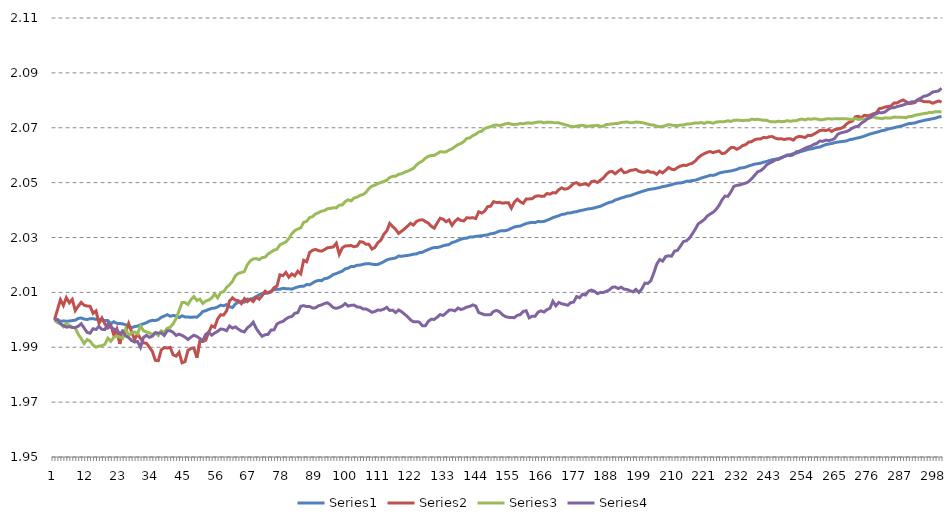
| Category | Series 0 | Series 1 | Series 2 | Series 3 |
|---|---|---|---|---|
| 0 | 2 | 2 | 2 | 2 |
| 1 | 2 | 2.004 | 1.999 | 2 |
| 2 | 1.999 | 2.007 | 1.999 | 1.999 |
| 3 | 2 | 2.005 | 1.997 | 1.998 |
| 4 | 1.999 | 2.008 | 1.999 | 1.997 |
| 5 | 2 | 2.006 | 1.998 | 1.997 |
| 6 | 2 | 2.007 | 1.997 | 1.997 |
| 7 | 2 | 2.003 | 1.997 | 1.997 |
| 8 | 2 | 2.005 | 1.995 | 1.998 |
| 9 | 2.001 | 2.006 | 1.993 | 1.999 |
| 10 | 2 | 2.005 | 1.991 | 1.997 |
| 11 | 2 | 2.005 | 1.993 | 1.995 |
| 12 | 2 | 2.005 | 1.992 | 1.995 |
| 13 | 2 | 2.002 | 1.991 | 1.997 |
| 14 | 2 | 2.003 | 1.99 | 1.997 |
| 15 | 2 | 1.999 | 1.99 | 1.998 |
| 16 | 2 | 2.001 | 1.991 | 1.997 |
| 17 | 2 | 1.998 | 1.991 | 1.996 |
| 18 | 2 | 1.997 | 1.993 | 1.999 |
| 19 | 1.999 | 1.998 | 1.992 | 1.997 |
| 20 | 1.999 | 1.994 | 1.994 | 1.997 |
| 21 | 1.999 | 1.997 | 1.994 | 1.996 |
| 22 | 1.999 | 1.991 | 1.994 | 1.995 |
| 23 | 1.999 | 1.996 | 1.993 | 1.996 |
| 24 | 1.998 | 1.996 | 1.997 | 1.994 |
| 25 | 1.998 | 1.999 | 1.994 | 1.994 |
| 26 | 1.997 | 1.996 | 1.995 | 1.992 |
| 27 | 1.998 | 1.993 | 1.996 | 1.992 |
| 28 | 1.998 | 1.995 | 1.995 | 1.992 |
| 29 | 1.998 | 1.993 | 1.998 | 1.99 |
| 30 | 1.999 | 1.992 | 1.996 | 1.994 |
| 31 | 1.999 | 1.991 | 1.996 | 1.994 |
| 32 | 2 | 1.99 | 1.995 | 1.994 |
| 33 | 2 | 1.988 | 1.995 | 1.994 |
| 34 | 2 | 1.985 | 1.995 | 1.995 |
| 35 | 2 | 1.985 | 1.994 | 1.995 |
| 36 | 2.001 | 1.989 | 1.996 | 1.995 |
| 37 | 2.001 | 1.99 | 1.995 | 1.994 |
| 38 | 2.002 | 1.99 | 1.997 | 1.996 |
| 39 | 2.001 | 1.99 | 1.997 | 1.996 |
| 40 | 2.002 | 1.987 | 1.999 | 1.995 |
| 41 | 2.001 | 1.987 | 2 | 1.994 |
| 42 | 2.001 | 1.988 | 2.003 | 1.995 |
| 43 | 2.001 | 1.984 | 2.006 | 1.994 |
| 44 | 2.001 | 1.985 | 2.006 | 1.994 |
| 45 | 2.001 | 1.989 | 2.006 | 1.993 |
| 46 | 2.001 | 1.99 | 2.007 | 1.994 |
| 47 | 2.001 | 1.99 | 2.008 | 1.994 |
| 48 | 2.001 | 1.986 | 2.007 | 1.994 |
| 49 | 2.002 | 1.992 | 2.008 | 1.993 |
| 50 | 2.003 | 1.992 | 2.006 | 1.992 |
| 51 | 2.003 | 1.993 | 2.007 | 1.995 |
| 52 | 2.004 | 1.995 | 2.007 | 1.996 |
| 53 | 2.004 | 1.998 | 2.008 | 1.994 |
| 54 | 2.004 | 1.997 | 2.009 | 1.995 |
| 55 | 2.005 | 2 | 2.008 | 1.996 |
| 56 | 2.005 | 2.002 | 2.01 | 1.997 |
| 57 | 2.005 | 2.002 | 2.01 | 1.997 |
| 58 | 2.006 | 2.003 | 2.012 | 1.996 |
| 59 | 2.005 | 2.007 | 2.013 | 1.998 |
| 60 | 2.004 | 2.008 | 2.014 | 1.997 |
| 61 | 2.006 | 2.007 | 2.016 | 1.997 |
| 62 | 2.006 | 2.007 | 2.017 | 1.997 |
| 63 | 2.007 | 2.006 | 2.017 | 1.996 |
| 64 | 2.006 | 2.008 | 2.018 | 1.996 |
| 65 | 2.008 | 2.007 | 2.02 | 1.997 |
| 66 | 2.007 | 2.007 | 2.021 | 1.998 |
| 67 | 2.008 | 2.007 | 2.022 | 1.999 |
| 68 | 2.008 | 2.008 | 2.022 | 1.997 |
| 69 | 2.009 | 2.008 | 2.022 | 1.995 |
| 70 | 2.01 | 2.009 | 2.023 | 1.994 |
| 71 | 2.01 | 2.01 | 2.023 | 1.995 |
| 72 | 2.01 | 2.01 | 2.024 | 1.995 |
| 73 | 2.01 | 2.01 | 2.025 | 1.996 |
| 74 | 2.011 | 2.012 | 2.025 | 1.996 |
| 75 | 2.011 | 2.012 | 2.026 | 1.998 |
| 76 | 2.011 | 2.016 | 2.027 | 1.999 |
| 77 | 2.011 | 2.016 | 2.028 | 1.999 |
| 78 | 2.011 | 2.017 | 2.028 | 2 |
| 79 | 2.011 | 2.016 | 2.03 | 2.001 |
| 80 | 2.011 | 2.017 | 2.031 | 2.001 |
| 81 | 2.012 | 2.016 | 2.033 | 2.002 |
| 82 | 2.012 | 2.018 | 2.033 | 2.003 |
| 83 | 2.012 | 2.017 | 2.033 | 2.005 |
| 84 | 2.012 | 2.022 | 2.036 | 2.005 |
| 85 | 2.013 | 2.021 | 2.036 | 2.005 |
| 86 | 2.013 | 2.025 | 2.037 | 2.005 |
| 87 | 2.013 | 2.025 | 2.038 | 2.004 |
| 88 | 2.014 | 2.026 | 2.039 | 2.004 |
| 89 | 2.014 | 2.025 | 2.039 | 2.005 |
| 90 | 2.014 | 2.025 | 2.04 | 2.005 |
| 91 | 2.015 | 2.026 | 2.04 | 2.006 |
| 92 | 2.015 | 2.026 | 2.041 | 2.006 |
| 93 | 2.016 | 2.026 | 2.041 | 2.005 |
| 94 | 2.017 | 2.027 | 2.041 | 2.004 |
| 95 | 2.017 | 2.028 | 2.041 | 2.004 |
| 96 | 2.017 | 2.024 | 2.042 | 2.005 |
| 97 | 2.018 | 2.026 | 2.042 | 2.005 |
| 98 | 2.019 | 2.027 | 2.043 | 2.006 |
| 99 | 2.019 | 2.027 | 2.044 | 2.005 |
| 100 | 2.019 | 2.027 | 2.043 | 2.005 |
| 101 | 2.019 | 2.027 | 2.044 | 2.005 |
| 102 | 2.02 | 2.027 | 2.045 | 2.005 |
| 103 | 2.02 | 2.028 | 2.045 | 2.005 |
| 104 | 2.02 | 2.028 | 2.046 | 2.004 |
| 105 | 2.02 | 2.028 | 2.046 | 2.004 |
| 106 | 2.02 | 2.028 | 2.048 | 2.003 |
| 107 | 2.02 | 2.026 | 2.049 | 2.003 |
| 108 | 2.02 | 2.026 | 2.049 | 2.003 |
| 109 | 2.02 | 2.028 | 2.05 | 2.004 |
| 110 | 2.021 | 2.029 | 2.05 | 2.003 |
| 111 | 2.021 | 2.031 | 2.05 | 2.004 |
| 112 | 2.022 | 2.032 | 2.051 | 2.005 |
| 113 | 2.022 | 2.035 | 2.052 | 2.003 |
| 114 | 2.022 | 2.034 | 2.052 | 2.004 |
| 115 | 2.023 | 2.033 | 2.052 | 2.003 |
| 116 | 2.023 | 2.031 | 2.053 | 2.004 |
| 117 | 2.023 | 2.032 | 2.053 | 2.003 |
| 118 | 2.023 | 2.033 | 2.054 | 2.002 |
| 119 | 2.023 | 2.034 | 2.054 | 2.001 |
| 120 | 2.024 | 2.035 | 2.055 | 2 |
| 121 | 2.024 | 2.035 | 2.055 | 1.999 |
| 122 | 2.024 | 2.036 | 2.056 | 1.999 |
| 123 | 2.024 | 2.036 | 2.057 | 1.999 |
| 124 | 2.025 | 2.036 | 2.058 | 1.998 |
| 125 | 2.025 | 2.036 | 2.059 | 1.998 |
| 126 | 2.026 | 2.035 | 2.06 | 1.999 |
| 127 | 2.026 | 2.034 | 2.06 | 2 |
| 128 | 2.026 | 2.033 | 2.06 | 2 |
| 129 | 2.026 | 2.035 | 2.061 | 2.001 |
| 130 | 2.027 | 2.037 | 2.061 | 2.002 |
| 131 | 2.027 | 2.037 | 2.061 | 2.002 |
| 132 | 2.027 | 2.036 | 2.061 | 2.002 |
| 133 | 2.027 | 2.036 | 2.062 | 2.004 |
| 134 | 2.028 | 2.034 | 2.062 | 2.004 |
| 135 | 2.028 | 2.036 | 2.063 | 2.003 |
| 136 | 2.029 | 2.037 | 2.064 | 2.004 |
| 137 | 2.029 | 2.036 | 2.064 | 2.004 |
| 138 | 2.03 | 2.036 | 2.065 | 2.004 |
| 139 | 2.03 | 2.037 | 2.066 | 2.005 |
| 140 | 2.03 | 2.037 | 2.066 | 2.005 |
| 141 | 2.03 | 2.037 | 2.067 | 2.005 |
| 142 | 2.03 | 2.037 | 2.068 | 2.005 |
| 143 | 2.031 | 2.039 | 2.068 | 2.003 |
| 144 | 2.031 | 2.039 | 2.069 | 2.002 |
| 145 | 2.031 | 2.04 | 2.07 | 2.002 |
| 146 | 2.031 | 2.041 | 2.07 | 2.002 |
| 147 | 2.031 | 2.041 | 2.07 | 2.002 |
| 148 | 2.031 | 2.043 | 2.071 | 2.003 |
| 149 | 2.032 | 2.043 | 2.071 | 2.003 |
| 150 | 2.032 | 2.043 | 2.071 | 2.003 |
| 151 | 2.032 | 2.042 | 2.071 | 2.002 |
| 152 | 2.032 | 2.043 | 2.071 | 2.001 |
| 153 | 2.033 | 2.043 | 2.072 | 2.001 |
| 154 | 2.033 | 2.041 | 2.071 | 2.001 |
| 155 | 2.034 | 2.043 | 2.071 | 2.001 |
| 156 | 2.034 | 2.044 | 2.071 | 2.002 |
| 157 | 2.034 | 2.043 | 2.072 | 2.002 |
| 158 | 2.035 | 2.042 | 2.071 | 2.003 |
| 159 | 2.035 | 2.044 | 2.072 | 2.003 |
| 160 | 2.035 | 2.044 | 2.072 | 2.001 |
| 161 | 2.036 | 2.044 | 2.072 | 2.001 |
| 162 | 2.035 | 2.045 | 2.072 | 2.001 |
| 163 | 2.036 | 2.045 | 2.072 | 2.003 |
| 164 | 2.036 | 2.045 | 2.072 | 2.003 |
| 165 | 2.036 | 2.045 | 2.072 | 2.003 |
| 166 | 2.036 | 2.046 | 2.072 | 2.004 |
| 167 | 2.037 | 2.046 | 2.072 | 2.004 |
| 168 | 2.037 | 2.046 | 2.072 | 2.007 |
| 169 | 2.038 | 2.046 | 2.072 | 2.005 |
| 170 | 2.038 | 2.047 | 2.072 | 2.006 |
| 171 | 2.038 | 2.048 | 2.071 | 2.006 |
| 172 | 2.039 | 2.048 | 2.071 | 2.006 |
| 173 | 2.039 | 2.048 | 2.071 | 2.005 |
| 174 | 2.039 | 2.049 | 2.07 | 2.006 |
| 175 | 2.039 | 2.05 | 2.07 | 2.006 |
| 176 | 2.039 | 2.05 | 2.071 | 2.008 |
| 177 | 2.04 | 2.049 | 2.071 | 2.008 |
| 178 | 2.04 | 2.049 | 2.071 | 2.009 |
| 179 | 2.04 | 2.05 | 2.071 | 2.009 |
| 180 | 2.04 | 2.049 | 2.07 | 2.01 |
| 181 | 2.041 | 2.05 | 2.071 | 2.011 |
| 182 | 2.041 | 2.051 | 2.071 | 2.01 |
| 183 | 2.041 | 2.05 | 2.071 | 2.01 |
| 184 | 2.041 | 2.051 | 2.071 | 2.01 |
| 185 | 2.042 | 2.052 | 2.071 | 2.01 |
| 186 | 2.042 | 2.053 | 2.071 | 2.01 |
| 187 | 2.043 | 2.054 | 2.071 | 2.011 |
| 188 | 2.043 | 2.054 | 2.071 | 2.012 |
| 189 | 2.044 | 2.053 | 2.072 | 2.012 |
| 190 | 2.044 | 2.054 | 2.072 | 2.011 |
| 191 | 2.044 | 2.055 | 2.072 | 2.012 |
| 192 | 2.045 | 2.054 | 2.072 | 2.011 |
| 193 | 2.045 | 2.054 | 2.072 | 2.011 |
| 194 | 2.045 | 2.054 | 2.072 | 2.011 |
| 195 | 2.046 | 2.055 | 2.072 | 2.01 |
| 196 | 2.046 | 2.055 | 2.072 | 2.011 |
| 197 | 2.046 | 2.054 | 2.072 | 2.01 |
| 198 | 2.047 | 2.054 | 2.072 | 2.011 |
| 199 | 2.047 | 2.054 | 2.072 | 2.013 |
| 200 | 2.047 | 2.054 | 2.071 | 2.013 |
| 201 | 2.048 | 2.054 | 2.071 | 2.014 |
| 202 | 2.048 | 2.054 | 2.071 | 2.017 |
| 203 | 2.048 | 2.053 | 2.071 | 2.02 |
| 204 | 2.048 | 2.054 | 2.07 | 2.022 |
| 205 | 2.049 | 2.054 | 2.07 | 2.021 |
| 206 | 2.049 | 2.055 | 2.071 | 2.023 |
| 207 | 2.049 | 2.056 | 2.071 | 2.023 |
| 208 | 2.049 | 2.055 | 2.071 | 2.023 |
| 209 | 2.05 | 2.055 | 2.071 | 2.025 |
| 210 | 2.05 | 2.055 | 2.071 | 2.025 |
| 211 | 2.05 | 2.056 | 2.071 | 2.027 |
| 212 | 2.05 | 2.056 | 2.071 | 2.029 |
| 213 | 2.05 | 2.056 | 2.071 | 2.029 |
| 214 | 2.051 | 2.057 | 2.071 | 2.03 |
| 215 | 2.051 | 2.057 | 2.071 | 2.031 |
| 216 | 2.051 | 2.058 | 2.072 | 2.033 |
| 217 | 2.051 | 2.059 | 2.072 | 2.035 |
| 218 | 2.052 | 2.06 | 2.072 | 2.036 |
| 219 | 2.052 | 2.061 | 2.072 | 2.037 |
| 220 | 2.052 | 2.061 | 2.072 | 2.038 |
| 221 | 2.053 | 2.061 | 2.072 | 2.039 |
| 222 | 2.053 | 2.061 | 2.072 | 2.039 |
| 223 | 2.053 | 2.061 | 2.072 | 2.04 |
| 224 | 2.053 | 2.062 | 2.072 | 2.042 |
| 225 | 2.054 | 2.061 | 2.072 | 2.044 |
| 226 | 2.054 | 2.061 | 2.072 | 2.045 |
| 227 | 2.054 | 2.062 | 2.073 | 2.045 |
| 228 | 2.054 | 2.063 | 2.072 | 2.047 |
| 229 | 2.055 | 2.063 | 2.073 | 2.049 |
| 230 | 2.055 | 2.062 | 2.073 | 2.049 |
| 231 | 2.055 | 2.063 | 2.073 | 2.049 |
| 232 | 2.055 | 2.064 | 2.073 | 2.05 |
| 233 | 2.056 | 2.064 | 2.073 | 2.05 |
| 234 | 2.056 | 2.065 | 2.073 | 2.05 |
| 235 | 2.056 | 2.065 | 2.073 | 2.051 |
| 236 | 2.057 | 2.066 | 2.073 | 2.053 |
| 237 | 2.057 | 2.066 | 2.073 | 2.054 |
| 238 | 2.057 | 2.066 | 2.073 | 2.054 |
| 239 | 2.057 | 2.066 | 2.073 | 2.055 |
| 240 | 2.058 | 2.066 | 2.073 | 2.056 |
| 241 | 2.058 | 2.067 | 2.072 | 2.057 |
| 242 | 2.058 | 2.067 | 2.072 | 2.058 |
| 243 | 2.059 | 2.066 | 2.072 | 2.058 |
| 244 | 2.059 | 2.066 | 2.072 | 2.058 |
| 245 | 2.059 | 2.066 | 2.072 | 2.059 |
| 246 | 2.059 | 2.066 | 2.072 | 2.06 |
| 247 | 2.06 | 2.066 | 2.073 | 2.06 |
| 248 | 2.06 | 2.066 | 2.072 | 2.06 |
| 249 | 2.061 | 2.065 | 2.073 | 2.06 |
| 250 | 2.061 | 2.066 | 2.073 | 2.061 |
| 251 | 2.061 | 2.067 | 2.073 | 2.061 |
| 252 | 2.061 | 2.067 | 2.073 | 2.062 |
| 253 | 2.062 | 2.066 | 2.073 | 2.063 |
| 254 | 2.062 | 2.067 | 2.073 | 2.063 |
| 255 | 2.062 | 2.067 | 2.073 | 2.063 |
| 256 | 2.063 | 2.068 | 2.073 | 2.064 |
| 257 | 2.063 | 2.068 | 2.073 | 2.064 |
| 258 | 2.063 | 2.069 | 2.073 | 2.065 |
| 259 | 2.063 | 2.069 | 2.073 | 2.065 |
| 260 | 2.064 | 2.069 | 2.073 | 2.065 |
| 261 | 2.064 | 2.069 | 2.073 | 2.065 |
| 262 | 2.064 | 2.069 | 2.073 | 2.066 |
| 263 | 2.065 | 2.069 | 2.073 | 2.066 |
| 264 | 2.065 | 2.07 | 2.073 | 2.068 |
| 265 | 2.065 | 2.07 | 2.073 | 2.068 |
| 266 | 2.065 | 2.07 | 2.073 | 2.068 |
| 267 | 2.065 | 2.071 | 2.073 | 2.069 |
| 268 | 2.066 | 2.072 | 2.073 | 2.069 |
| 269 | 2.066 | 2.072 | 2.073 | 2.07 |
| 270 | 2.066 | 2.074 | 2.073 | 2.07 |
| 271 | 2.066 | 2.074 | 2.073 | 2.071 |
| 272 | 2.067 | 2.074 | 2.073 | 2.072 |
| 273 | 2.067 | 2.075 | 2.073 | 2.072 |
| 274 | 2.067 | 2.074 | 2.073 | 2.073 |
| 275 | 2.068 | 2.075 | 2.074 | 2.074 |
| 276 | 2.068 | 2.075 | 2.074 | 2.075 |
| 277 | 2.068 | 2.075 | 2.074 | 2.075 |
| 278 | 2.069 | 2.077 | 2.073 | 2.076 |
| 279 | 2.069 | 2.077 | 2.073 | 2.075 |
| 280 | 2.069 | 2.078 | 2.074 | 2.076 |
| 281 | 2.07 | 2.078 | 2.074 | 2.077 |
| 282 | 2.07 | 2.078 | 2.074 | 2.077 |
| 283 | 2.07 | 2.079 | 2.074 | 2.077 |
| 284 | 2.07 | 2.079 | 2.074 | 2.078 |
| 285 | 2.07 | 2.08 | 2.074 | 2.078 |
| 286 | 2.071 | 2.08 | 2.074 | 2.078 |
| 287 | 2.071 | 2.08 | 2.074 | 2.079 |
| 288 | 2.072 | 2.079 | 2.074 | 2.079 |
| 289 | 2.072 | 2.079 | 2.074 | 2.079 |
| 290 | 2.072 | 2.079 | 2.075 | 2.08 |
| 291 | 2.072 | 2.08 | 2.075 | 2.08 |
| 292 | 2.072 | 2.08 | 2.075 | 2.081 |
| 293 | 2.073 | 2.08 | 2.075 | 2.081 |
| 294 | 2.073 | 2.079 | 2.075 | 2.082 |
| 295 | 2.073 | 2.079 | 2.076 | 2.082 |
| 296 | 2.073 | 2.079 | 2.076 | 2.083 |
| 297 | 2.074 | 2.079 | 2.076 | 2.083 |
| 298 | 2.074 | 2.08 | 2.076 | 2.083 |
| 299 | 2.074 | 2.079 | 2.076 | 2.084 |